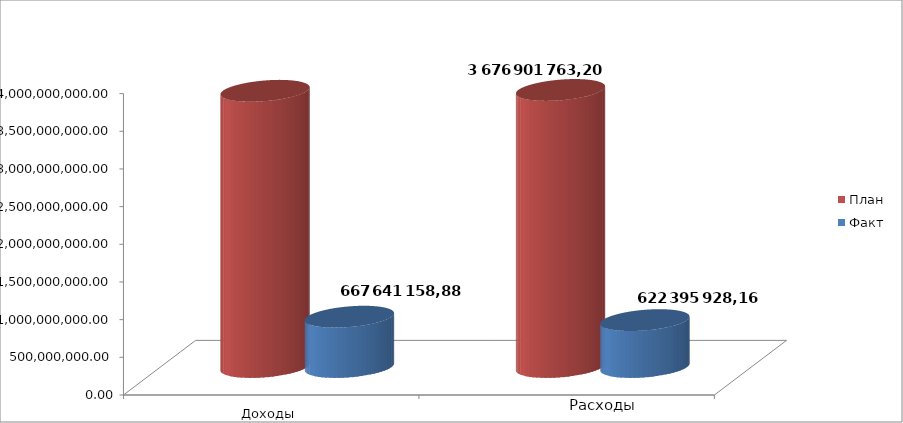
| Category | План | Факт |
|---|---|---|
| 0 | 3665825743 | 667641158.88 |
| 1 | 3676901763.2 | 622395928.16 |